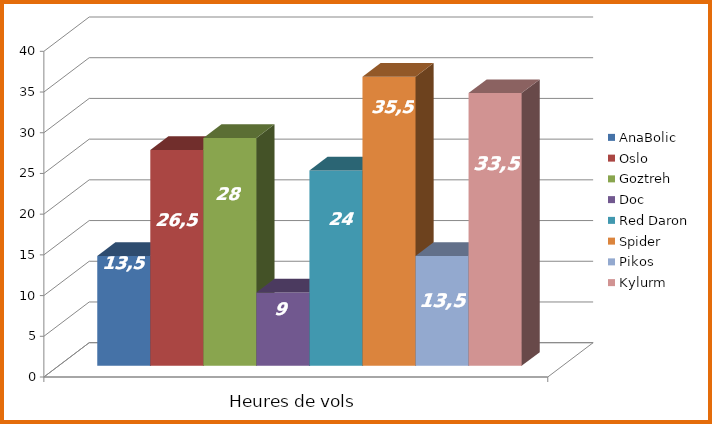
| Category | AnaBolic | Oslo | Goztreh | Doc | Red Daron | Spider | Pikos | Kylurm |
|---|---|---|---|---|---|---|---|---|
| 0 | 13.5 | 26.5 | 28 | 9 | 24 | 35.5 | 13.5 | 33.5 |